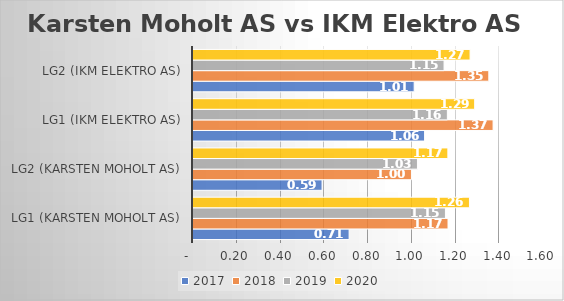
| Category | 2017 | 2018 | 2019 | 2020 |
|---|---|---|---|---|
| LG1 (Karsten Moholt AS) | 0.714 | 1.166 | 1.154 | 1.264 |
| LG2 (Karsten Moholt AS) | 0.59 | 0.999 | 1.026 | 1.165 |
| LG1 (IKM Elektro AS) | 1.059 | 1.372 | 1.163 | 1.288 |
| LG2 (IKM Elektro AS) | 1.011 | 1.352 | 1.148 | 1.267 |